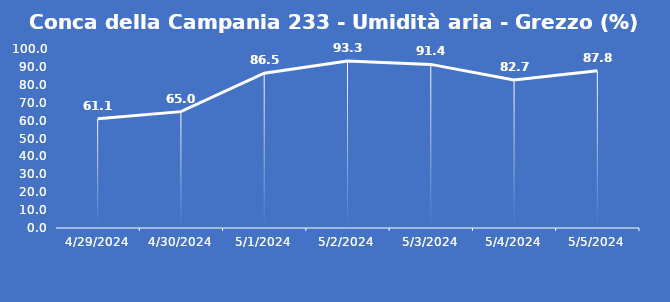
| Category | Conca della Campania 233 - Umidità aria - Grezzo (%) |
|---|---|
| 4/29/24 | 61.1 |
| 4/30/24 | 65 |
| 5/1/24 | 86.5 |
| 5/2/24 | 93.3 |
| 5/3/24 | 91.4 |
| 5/4/24 | 82.7 |
| 5/5/24 | 87.8 |